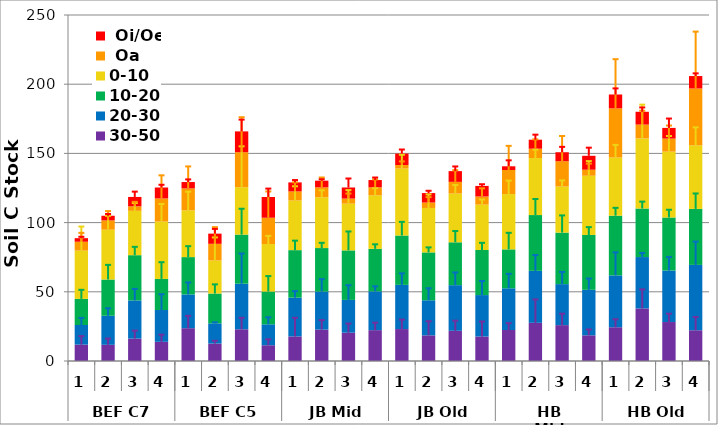
| Category | 30-50 | 20-30 | 10-20 | 0-10 |  Oa |  Oi/Oe |
|---|---|---|---|---|---|---|
| 0 | 11.845 | 14.181 | 18.875 | 34.858 | 6.415 | 2.576 |
| 1 | 11.704 | 20.987 | 26.184 | 36.007 | 6.718 | 3.35 |
| 2 | 16.218 | 27.558 | 32.682 | 32.036 | 3.253 | 6.801 |
| 3 | 13.876 | 22.988 | 22.448 | 41.438 | 16.701 | 7.906 |
| 4 | 23.706 | 24.371 | 26.989 | 33.758 | 15.886 | 4.6 |
| 5 | 12.578 | 14.62 | 21.55 | 23.887 | 12.034 | 7.358 |
| 6 | 22.916 | 32.953 | 35.454 | 34.266 | 25.28 | 15.025 |
| 7 | 11.383 | 15.126 | 23.664 | 34.331 | 19.005 | 14.98 |
| 8 | 17.777 | 27.994 | 34.338 | 35.867 | 6.552 | 6.515 |
| 9 | 22.712 | 27.466 | 31.431 | 36.712 | 7.136 | 4.846 |
| 10 | 20.457 | 23.687 | 35.78 | 33.78 | 3.646 | 8.02 |
| 11 | 22.296 | 28.022 | 30.73 | 38.699 | 5.74 | 5.267 |
| 12 | 23.084 | 31.934 | 35.671 | 48.306 | 2.603 | 8.27 |
| 13 | 18.516 | 25.358 | 34.592 | 32.119 | 3.919 | 6.835 |
| 14 | 21.824 | 32.974 | 30.976 | 35.242 | 8.431 | 7.752 |
| 15 | 17.689 | 29.943 | 32.561 | 32.797 | 5.885 | 7.625 |
| 16 | 22.414 | 30.118 | 28.121 | 39.947 | 17.424 | 2.655 |
| 17 | 27.582 | 37.557 | 40.317 | 41.174 | 6.752 | 6.527 |
| 18 | 25.92 | 29.628 | 37.231 | 33.293 | 18.261 | 6.505 |
| 19 | 18.549 | 32.896 | 39.634 | 42.777 | 4.366 | 10.05 |
| 20 | 24.399 | 37.459 | 43.135 | 42.057 | 35.513 | 9.998 |
| 21 | 37.967 | 37.14 | 35.064 | 50.652 | 10.006 | 9.249 |
| 22 | 28.159 | 37.202 | 38.341 | 47.555 | 9.436 | 7.73 |
| 23 | 22.21 | 47.245 | 40.462 | 45.945 | 41.066 | 8.954 |